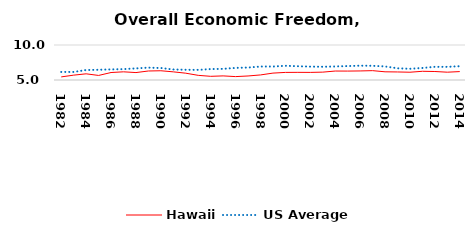
| Category | Hawaii | US Average |
|---|---|---|
| 1982.0 | 5.443 | 6.149 |
| 1983.0 | 5.693 | 6.152 |
| 1984.0 | 5.882 | 6.429 |
| 1985.0 | 5.652 | 6.464 |
| 1986.0 | 6.068 | 6.512 |
| 1987.0 | 6.168 | 6.552 |
| 1988.0 | 6.062 | 6.659 |
| 1989.0 | 6.286 | 6.767 |
| 1990.0 | 6.32 | 6.71 |
| 1991.0 | 6.165 | 6.502 |
| 1992.0 | 5.971 | 6.463 |
| 1993.0 | 5.665 | 6.446 |
| 1994.0 | 5.526 | 6.563 |
| 1995.0 | 5.587 | 6.593 |
| 1996.0 | 5.486 | 6.73 |
| 1997.0 | 5.574 | 6.781 |
| 1998.0 | 5.724 | 6.926 |
| 1999.0 | 5.985 | 6.925 |
| 2000.0 | 6.084 | 7.031 |
| 2001.0 | 6.092 | 6.969 |
| 2002.0 | 6.086 | 6.912 |
| 2003.0 | 6.125 | 6.892 |
| 2004.0 | 6.281 | 6.934 |
| 2005.0 | 6.273 | 6.99 |
| 2006.0 | 6.294 | 7.048 |
| 2007.0 | 6.337 | 7.028 |
| 2008.0 | 6.171 | 6.935 |
| 2009.0 | 6.149 | 6.668 |
| 2010.0 | 6.11 | 6.605 |
| 2011.0 | 6.245 | 6.72 |
| 2012.0 | 6.214 | 6.883 |
| 2013.0 | 6.114 | 6.881 |
| 2014.0 | 6.201 | 6.973 |